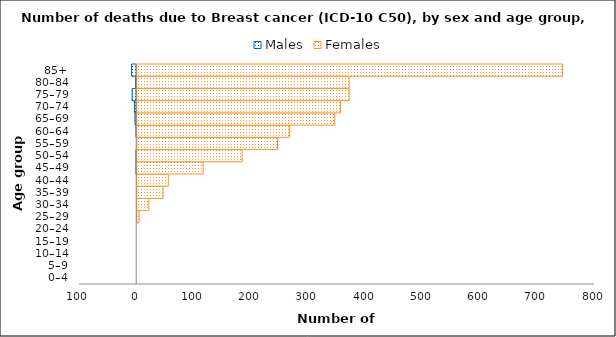
| Category | Males | Females |
|---|---|---|
| 0–4 | 0 | 0 |
| 5–9 | 0 | 0 |
| 10–14 | 0 | 0 |
| 15–19 | 0 | 0 |
| 20–24 | 0 | 0 |
| 25–29 | 0 | 5 |
| 30–34 | 0 | 22 |
| 35–39 | 0 | 47 |
| 40–44 | 0 | 56 |
| 45–49 | -1 | 117 |
| 50–54 | -1 | 185 |
| 55–59 | 0 | 247 |
| 60–64 | -1 | 268 |
| 65–69 | -3 | 347 |
| 70–74 | -4 | 357 |
| 75–79 | -8 | 372 |
| 80–84 | -2 | 372 |
| 85+ | -9 | 745 |